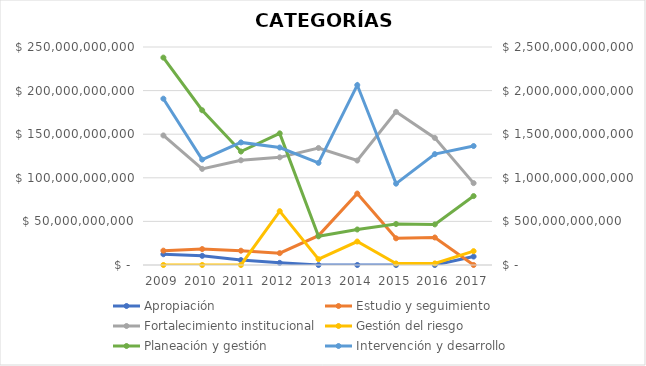
| Category | Apropiación | Estudio y seguimiento | Fortalecimiento institucional | Gestión del riesgo | Planeación y gestión |
|---|---|---|---|---|---|
| 2009.0 | 12363268056.791 | 16450074547.189 | 148569606074.95 | 0 | 237845496900.013 |
| 2010.0 | 10507482502.299 | 18284129333.051 | 110224816362.641 | 0 | 177455977672.064 |
| 2011.0 | 5650574238.868 | 16390884253.25 | 120075132565.924 | 0 | 130130225720.523 |
| 2012.0 | 2447157604.171 | 13601714202.534 | 123461503742.065 | 61730470997.389 | 150969211515.555 |
| 2013.0 | 0 | 33669685655.464 | 134194006939.857 | 6661268744.786 | 32868192110.973 |
| 2014.0 | 0 | 81924109339.539 | 119808264271.158 | 26913936733.855 | 40725596127.418 |
| 2015.0 | 0 | 30595838107.806 | 175621489372.374 | 1770326146.111 | 47032631270.826 |
| 2016.0 | 0 | 31557758678.7 | 145760239337.347 | 1798586309.484 | 46574460453.057 |
| 2017.0 | 9700000000 | 0 | 93889217000 | 15882160000 | 79032352000 |